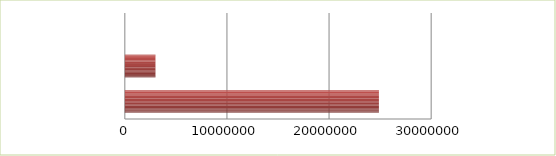
| Category | Series 0 | Series 1 |
|---|---|---|
| 0 | 2.5 | 24882127 |
| 1 | 2.6 | 3000000 |
| 2 | 2.7 | 0 |